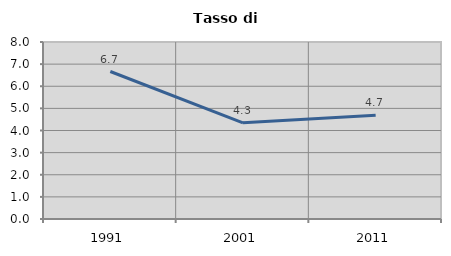
| Category | Tasso di disoccupazione   |
|---|---|
| 1991.0 | 6.667 |
| 2001.0 | 4.348 |
| 2011.0 | 4.688 |